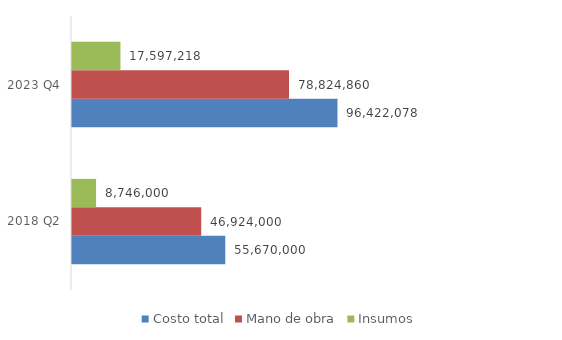
| Category | Costo total | Mano de obra | Insumos |
|---|---|---|---|
| 2018 Q2 | 55670000 | 46924000 | 8746000 |
| 2023 Q4 | 96422077.718 | 78824860 | 17597217.718 |